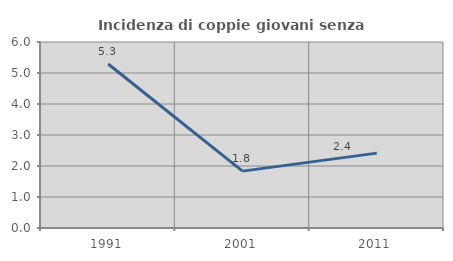
| Category | Incidenza di coppie giovani senza figli |
|---|---|
| 1991.0 | 5.291 |
| 2001.0 | 1.835 |
| 2011.0 | 2.415 |